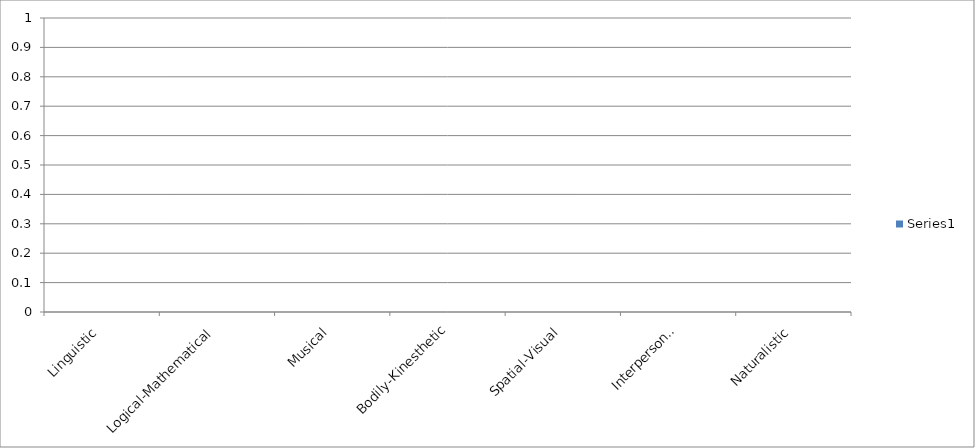
| Category | Series 0 |
|---|---|
| Linguistic | 0 |
| Logical-Mathematical | 0 |
| Musical | 0 |
| Bodily-Kinesthetic | 0 |
| Spatial-Visual | 0 |
| Interpersonal | 0 |
| Naturalistic | 0 |